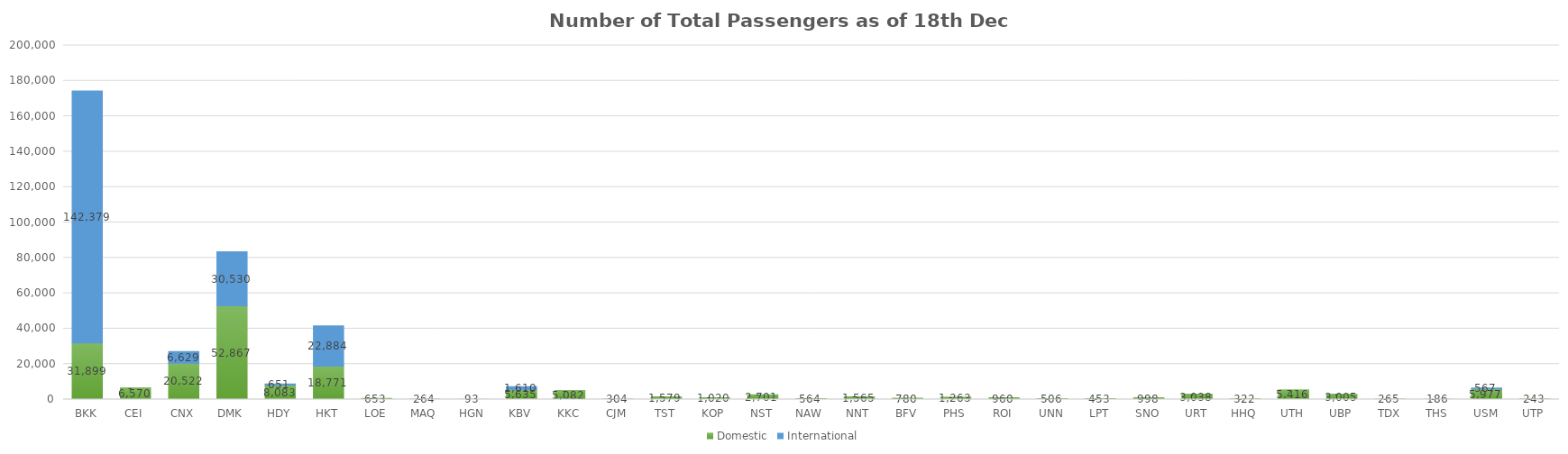
| Category | Domestic | International |
|---|---|---|
| BKK | 31899 | 142379 |
| CEI | 6570 | 0 |
| CNX | 20522 | 6629 |
| DMK | 52867 | 30530 |
| HDY | 8083 | 651 |
| HKT | 18771 | 22884 |
| LOE | 653 | 0 |
| MAQ | 264 | 0 |
| HGN | 93 | 0 |
| KBV | 5635 | 1610 |
| KKC | 5082 | 0 |
| CJM | 304 | 0 |
| TST | 1579 | 0 |
| KOP | 1020 | 0 |
| NST | 2701 | 0 |
| NAW | 564 | 0 |
| NNT | 1565 | 0 |
| BFV | 780 | 0 |
| PHS | 1263 | 0 |
| ROI | 960 | 0 |
| UNN | 506 | 0 |
| LPT | 453 | 0 |
| SNO | 998 | 0 |
| URT | 3038 | 0 |
| HHQ | 322 | 0 |
| UTH | 5416 | 0 |
| UBP | 3005 | 0 |
| TDX | 265 | 0 |
| THS | 186 | 0 |
| USM | 5977 | 567 |
| UTP | 243 | 0 |